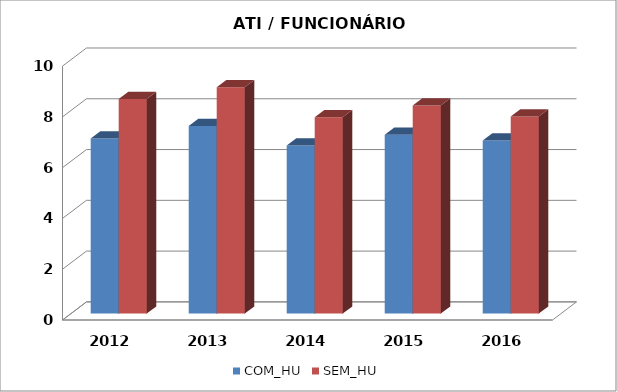
| Category | COM_HU | SEM_HU |
|---|---|---|
| 2012.0 | 6.894 | 8.454 |
| 2013.0 | 7.393 | 8.918 |
| 2014.0 | 6.622 | 7.738 |
| 2015.0 | 7.043 | 8.196 |
| 2016.0 | 6.82 | 7.769 |